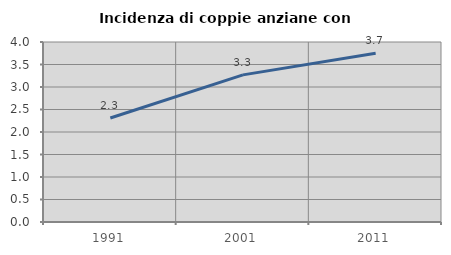
| Category | Incidenza di coppie anziane con figli |
|---|---|
| 1991.0 | 2.312 |
| 2001.0 | 3.27 |
| 2011.0 | 3.748 |